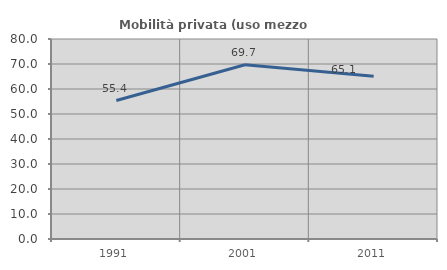
| Category | Mobilità privata (uso mezzo privato) |
|---|---|
| 1991.0 | 55.375 |
| 2001.0 | 69.721 |
| 2011.0 | 65.082 |